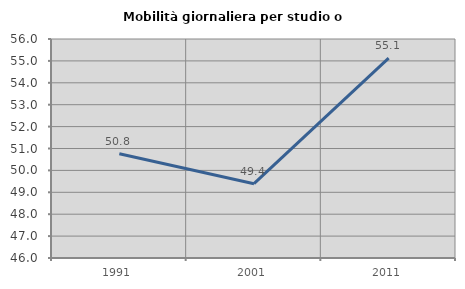
| Category | Mobilità giornaliera per studio o lavoro |
|---|---|
| 1991.0 | 50.761 |
| 2001.0 | 49.394 |
| 2011.0 | 55.127 |